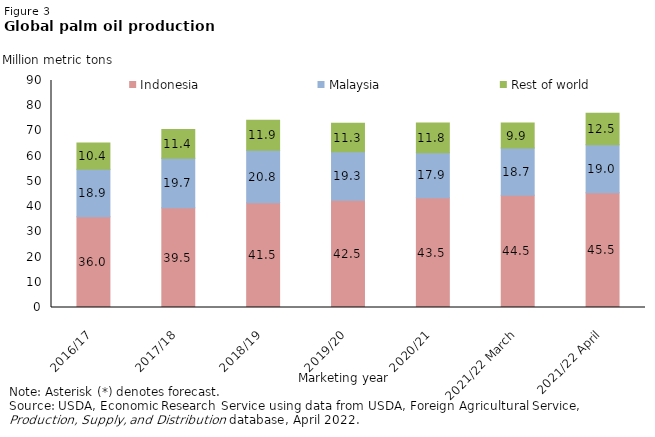
| Category | Indonesia | Malaysia | Rest of world |
|---|---|---|---|
| 2016/17 | 36 | 18.858 | 10.405 |
| 2017/18 | 39.5 | 19.683 | 11.423 |
| 2018/19 | 41.5 | 20.8 | 11.949 |
| 2019/20 | 42.5 | 19.255 | 11.276 |
| 2020/21 | 43.5 | 17.854 | 11.751 |
| 2021/22 March | 44.5 | 18.7 | 9.905 |
| 2021/22 April | 45.5 | 19 | 12.547 |